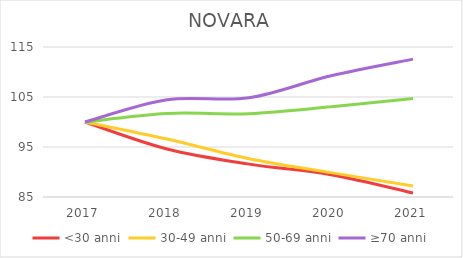
| Category | <30 anni | 30-49 anni | 50-69 anni | ≥70 anni |
|---|---|---|---|---|
| 2017.0 | 100 | 100 | 100 | 100 |
| 2018.0 | 94.593 | 96.585 | 101.706 | 104.452 |
| 2019.0 | 91.573 | 92.667 | 101.67 | 104.845 |
| 2020.0 | 89.466 | 89.875 | 103.034 | 109.254 |
| 2021.0 | 85.815 | 87.205 | 104.695 | 112.571 |